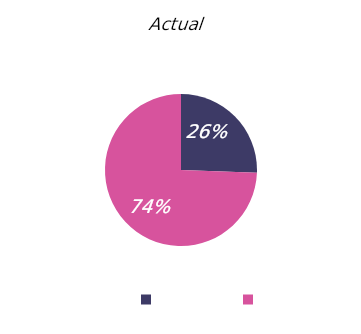
| Category | Actual |
|---|---|
|  | 12800 |
|  | 37200 |